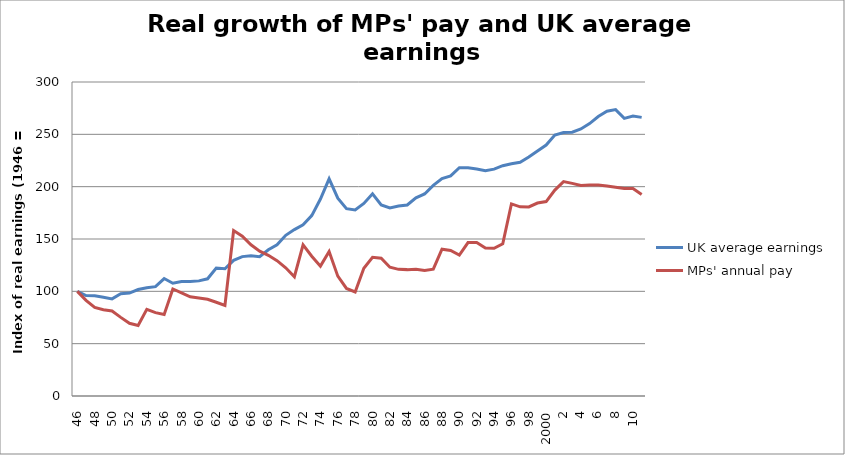
| Category | UK average earnings | MPs' annual pay |
|---|---|---|
| 46.0 | 100 | 100 |
| 47.0 | 96.02 | 91.448 |
| 48.0 | 95.865 | 84.633 |
| 49.0 | 94.417 | 82.373 |
| 50.0 | 92.761 | 81.208 |
| 51.0 | 97.615 | 75.128 |
| 52.0 | 98.297 | 69.464 |
| 53.0 | 101.746 | 67.403 |
| 54.0 | 103.474 | 82.787 |
| 55.0 | 104.48 | 79.689 |
| 56.0 | 112.215 | 77.793 |
| 57.0 | 107.725 | 102.243 |
| 58.0 | 109.287 | 98.53 |
| 59.0 | 109.411 | 94.796 |
| 60.0 | 109.989 | 93.585 |
| 61.0 | 111.976 | 92.387 |
| 62.0 | 122.346 | 89.595 |
| 63.0 | 121.588 | 86.467 |
| 64.0 | 129.603 | 158.129 |
| 65.0 | 133.178 | 152.653 |
| 66.0 | 133.909 | 144.477 |
| 67.0 | 133.139 | 138.388 |
| 68.0 | 139.672 | 134.442 |
| 69.0 | 144.427 | 129.259 |
| 70.0 | 153.532 | 122.492 |
| 71.0 | 159.018 | 113.919 |
| 72.0 | 163.531 | 144.351 |
| 73.0 | 172.326 | 133.533 |
| 74.0 | 188.224 | 124.082 |
| 75.0 | 207.502 | 138.015 |
| 76.0 | 188.975 | 114.517 |
| 77.0 | 178.942 | 102.741 |
| 78.0 | 177.797 | 99.411 |
| 79.0 | 183.953 | 122.035 |
| 80.0 | 193.188 | 132.444 |
| 81.0 | 182.591 | 131.608 |
| 82.0 | 179.603 | 123.041 |
| 83.0 | 181.531 | 120.984 |
| 84.0 | 182.516 | 120.741 |
| 85.0 | 189.27 | 121.177 |
| 86.0 | 193.025 | 119.921 |
| 87.0 | 201.201 | 121.183 |
| 88.0 | 207.717 | 140.201 |
| 89.0 | 210.266 | 139.015 |
| 90.0 | 218.059 | 134.649 |
| 91.0 | 217.996 | 146.591 |
| 92.0 | 216.805 | 146.652 |
| 93.0 | 215.157 | 141.34 |
| 94.0 | 216.752 | 141.097 |
| 95.0 | 220.025 | 145.483 |
| 96.0 | 221.939 | 183.573 |
| 97.0 | 223.359 | 180.704 |
| 98.0 | 228.356 | 180.636 |
| 99.0 | 234.163 | 184.335 |
| 2000.0 | 239.782 | 185.779 |
| 1.0 | 249.263 | 196.702 |
| 2.0 | 251.788 | 204.858 |
| 3.0 | 252.007 | 203.176 |
| 4.0 | 255.133 | 201.061 |
| 5.0 | 260.239 | 201.61 |
| 6.0 | 267.033 | 201.549 |
| 7.0 | 272.018 | 200.588 |
| 8.0 | 273.647 | 199.392 |
| 9.0 | 265.255 | 198.16 |
| 10.0 | 267.496 | 198.269 |
| 2011.0 | 266.189 | 192.612 |